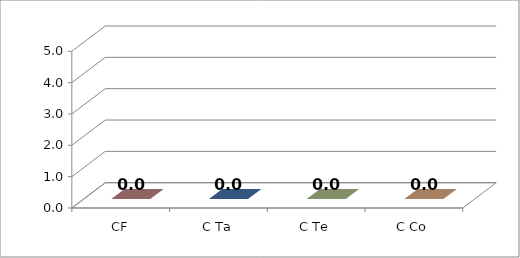
| Category | Series 0 |
|---|---|
| CF | 0 |
| C Ta | 0 |
| C Te | 0 |
| C Co | 0 |